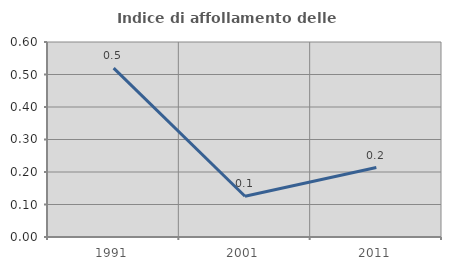
| Category | Indice di affollamento delle abitazioni  |
|---|---|
| 1991.0 | 0.52 |
| 2001.0 | 0.125 |
| 2011.0 | 0.214 |